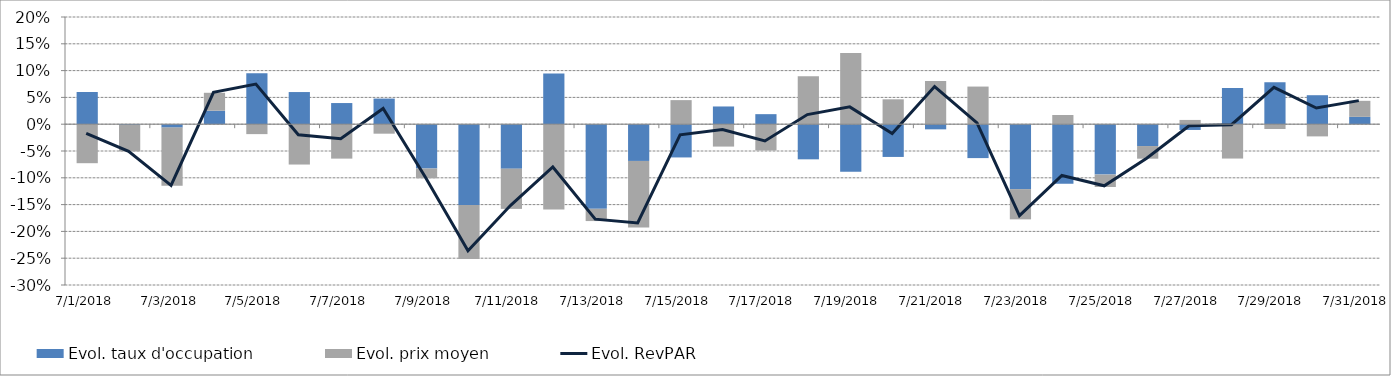
| Category | Evol. taux d'occupation | Evol. prix moyen |
|---|---|---|
| 7/1/18 | 0.06 | -0.073 |
| 7/2/18 | -0.001 | -0.049 |
| 7/3/18 | -0.006 | -0.109 |
| 7/4/18 | 0.025 | 0.033 |
| 7/5/18 | 0.095 | -0.019 |
| 7/6/18 | 0.06 | -0.075 |
| 7/7/18 | 0.039 | -0.064 |
| 7/8/18 | 0.048 | -0.018 |
| 7/9/18 | -0.083 | -0.018 |
| 7/10/18 | -0.151 | -0.101 |
| 7/11/18 | -0.083 | -0.075 |
| 7/12/18 | 0.094 | -0.159 |
| 7/13/18 | -0.158 | -0.023 |
| 7/14/18 | -0.069 | -0.124 |
| 7/15/18 | -0.062 | 0.045 |
| 7/16/18 | 0.033 | -0.042 |
| 7/17/18 | 0.019 | -0.049 |
| 7/18/18 | -0.066 | 0.089 |
| 7/19/18 | -0.089 | 0.133 |
| 7/20/18 | -0.061 | 0.046 |
| 7/21/18 | -0.01 | 0.081 |
| 7/22/18 | -0.063 | 0.07 |
| 7/23/18 | -0.121 | -0.056 |
| 7/24/18 | -0.111 | 0.017 |
| 7/25/18 | -0.094 | -0.023 |
| 7/26/18 | -0.041 | -0.024 |
| 7/27/18 | -0.011 | 0.008 |
| 7/28/18 | 0.068 | -0.064 |
| 7/29/18 | 0.078 | -0.009 |
| 7/30/18 | 0.054 | -0.023 |
| 7/31/18 | 0.014 | 0.03 |